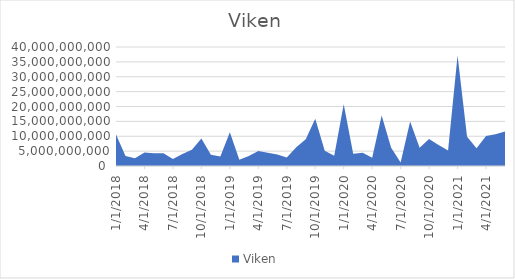
| Category | Viken |
|---|---|
| 1/1/18 | 10625025000 |
| 2/1/18 | 3349950000 |
| 3/1/18 | 2626200000 |
| 4/1/18 | 4540145000 |
| 5/1/18 | 4314930000 |
| 6/1/18 | 4252850000 |
| 7/1/18 | 2369026000 |
| 8/1/18 | 4058738000 |
| 9/1/18 | 5422550000 |
| 10/1/18 | 9203010000 |
| 11/1/18 | 3784350000 |
| 12/1/18 | 3155800000 |
| 1/1/19 | 11366850000 |
| 2/1/19 | 2115950000 |
| 3/1/19 | 3350600000 |
| 4/1/19 | 5059120000 |
| 5/1/19 | 4489275000 |
| 6/1/19 | 3847800000 |
| 7/1/19 | 2892600000 |
| 8/1/19 | 6328600000 |
| 9/1/19 | 8962200000 |
| 10/1/19 | 15870100000 |
| 11/1/19 | 5132650000 |
| 12/1/19 | 3460000000 |
| 1/1/20 | 20778750000 |
| 2/1/20 | 4120950000 |
| 3/1/20 | 4413950000 |
| 4/1/20 | 2758900000 |
| 5/1/20 | 16959350000 |
| 6/1/20 | 6120650000 |
| 7/1/20 | 1185960000 |
| 8/1/20 | 14987800000 |
| 9/1/20 | 6122010000 |
| 10/1/20 | 9074300000 |
| 11/1/20 | 7060950000 |
| 12/1/20 | 5198850000 |
| 1/1/21 | 37143900000 |
| 2/1/21 | 9858700000 |
| 3/1/21 | 5965050000 |
| 4/1/21 | 10094100000 |
| 5/1/21 | 10712550000 |
| 6/1/21 | 11605760000 |